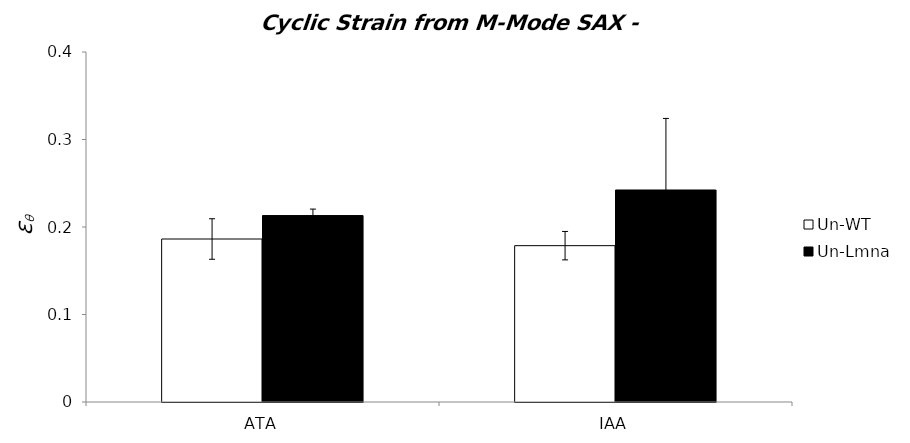
| Category | Un-WT | Un-Lmna |
|---|---|---|
| 0 | 0.186 | 0.213 |
| 1 | 0.179 | 0.242 |